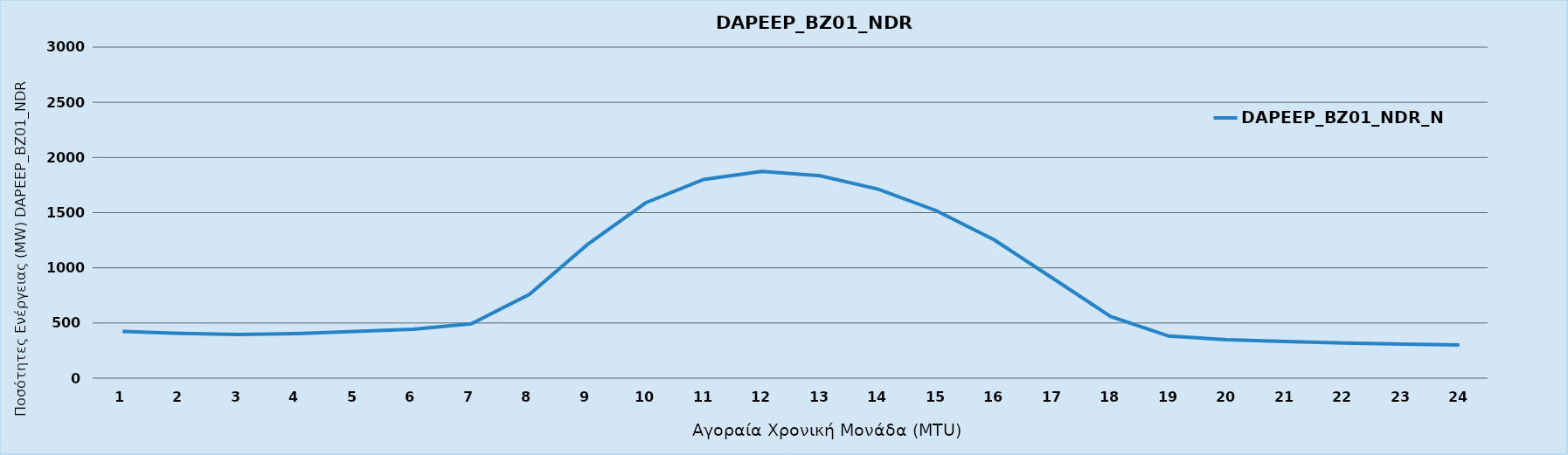
| Category | DAPEEP_BZ01_NDR_N1 |
|---|---|
| 0 | 424 |
| 1 | 406 |
| 2 | 396 |
| 3 | 404 |
| 4 | 423 |
| 5 | 444 |
| 6 | 493 |
| 7 | 760 |
| 8 | 1212 |
| 9 | 1589 |
| 10 | 1801 |
| 11 | 1874 |
| 12 | 1835 |
| 13 | 1713 |
| 14 | 1518 |
| 15 | 1252 |
| 16 | 906 |
| 17 | 558 |
| 18 | 381 |
| 19 | 348 |
| 20 | 333 |
| 21 | 318 |
| 22 | 309 |
| 23 | 301 |